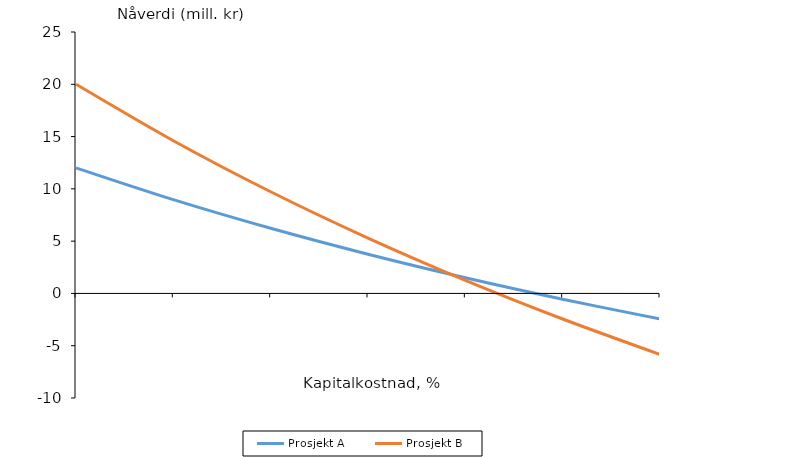
| Category | Prosjekt A | Prosjekt B |
|---|---|---|
| nan | 12 | 20 |
| 4.0 | 8.964 | 14.604 |
| 8.0 | 6.228 | 9.723 |
| 12.0 | 3.75 | 5.291 |
| 16.0 | 1.498 | 1.251 |
| 20.0 | -0.556 | -2.444 |
| 24.0 | -2.435 | -5.836 |